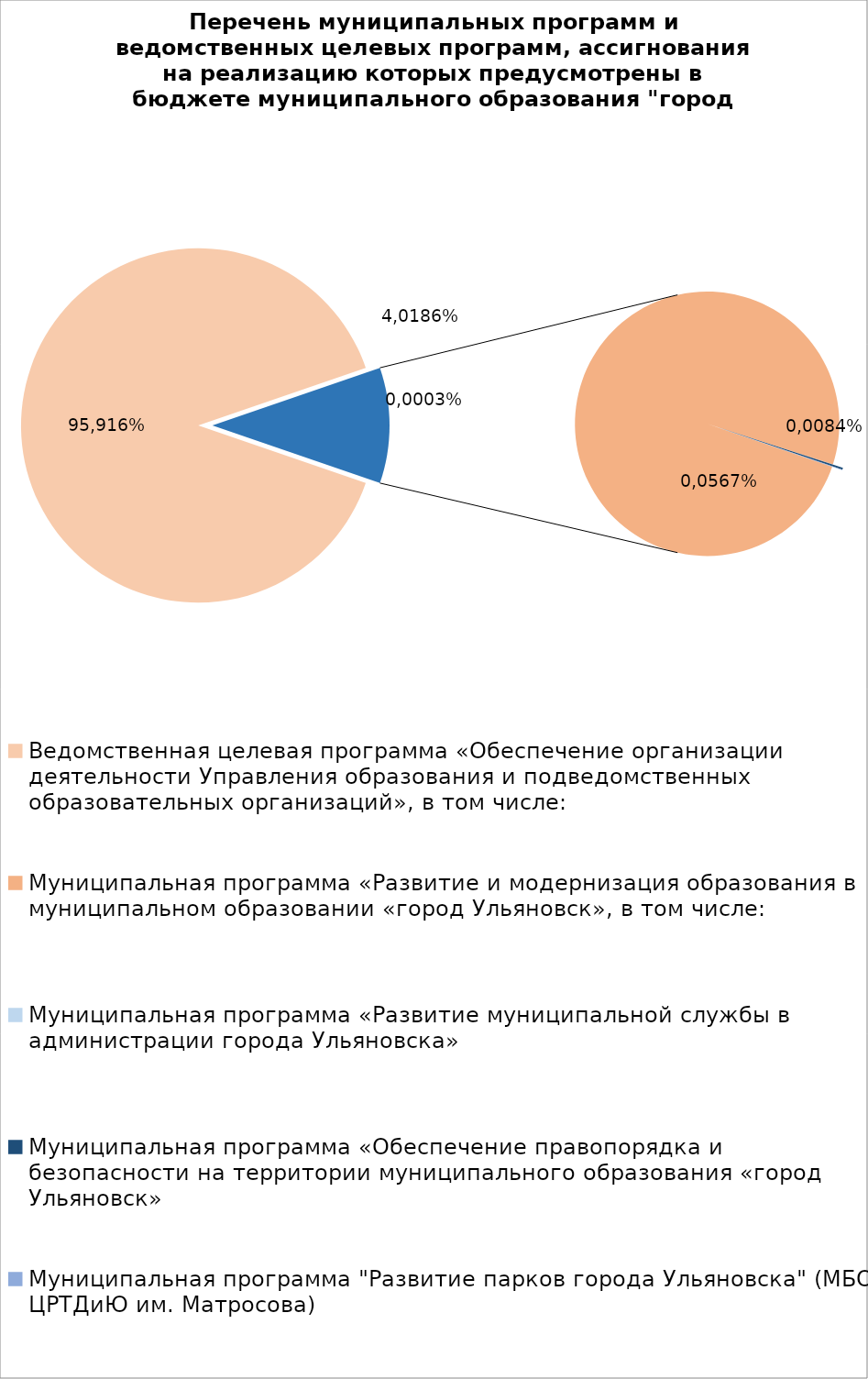
| Category | Series 0 |
|---|---|
| Ведомственная целевая программа «Обеспечение организации деятельности Управления образования и подведомственных образовательных организаций», в том числе: | 7800243.45 |
| Муниципальная программа «Развитие и модернизация образования в муниципальном образовании «город Ульяновск», в том числе: | 916923.81 |
| Муниципальная программа «Развитие муниципальной службы в администрации города Ульяновска» | 14.3 |
| Муниципальная программа «Обеспечение правопорядка и безопасности на территории муниципального образования «город Ульяновск» | 2083.73 |
| Муниципальная программа "Развитие парков города Ульяновска" (МБОУ ЦРТДиЮ им. Матросова) | 600 |